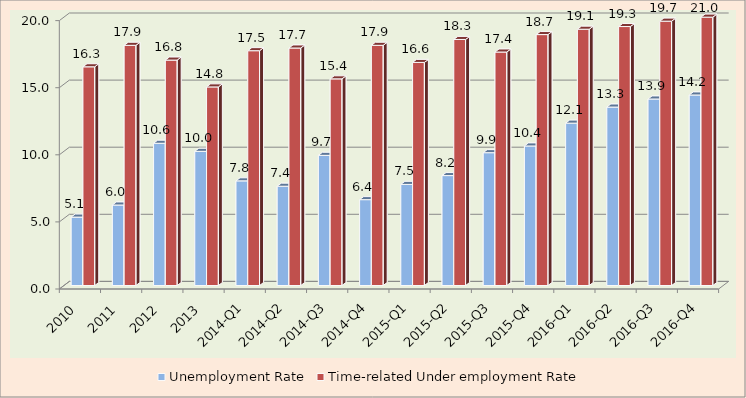
| Category | Unemployment Rate | Time-related Under employment Rate |
|---|---|---|
| 2010 | 5.1 | 16.3 |
| 2011 | 6 | 17.9 |
| 2012 | 10.6 | 16.8 |
| 2013 | 10 | 14.8 |
| 2014-Q1 | 7.8 | 17.5 |
| 2014-Q2 | 7.4 | 17.7 |
| 2014-Q3 | 9.7 | 15.4 |
| 2014-Q4 | 6.4 | 17.9 |
| 2015-Q1 | 7.535 | 16.625 |
| 2015-Q2 | 8.193 | 18.337 |
| 2015-Q3 | 9.9 | 17.4 |
| 2015-Q4 | 10.4 | 18.7 |
| 2016-Q1 | 12.1 | 19.1 |
| 2016-Q2 | 13.3 | 19.3 |
| 2016-Q3 | 13.9 | 19.7 |
| 2016-Q4 | 14.2 | 21 |